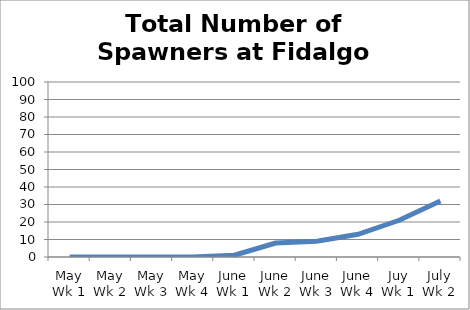
| Category | Number of Spawners |
|---|---|
| May Wk 1 | 0 |
| May Wk 2 | 0 |
| May Wk 3 | 0 |
| May Wk 4 | 0 |
| June Wk 1 | 1 |
| June Wk 2 | 8 |
| June Wk 3 | 9 |
| June Wk 4 | 13 |
| Juy Wk 1 | 21 |
| July Wk 2 | 32 |